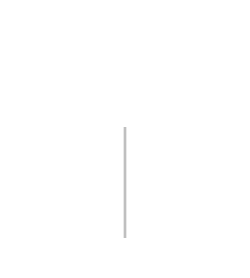
| Category | Positive | Negative |
|---|---|---|
| 0 | 0 | 0 |
| 1 | 5450 | 0 |
| 2 | 5450 | -5450 |